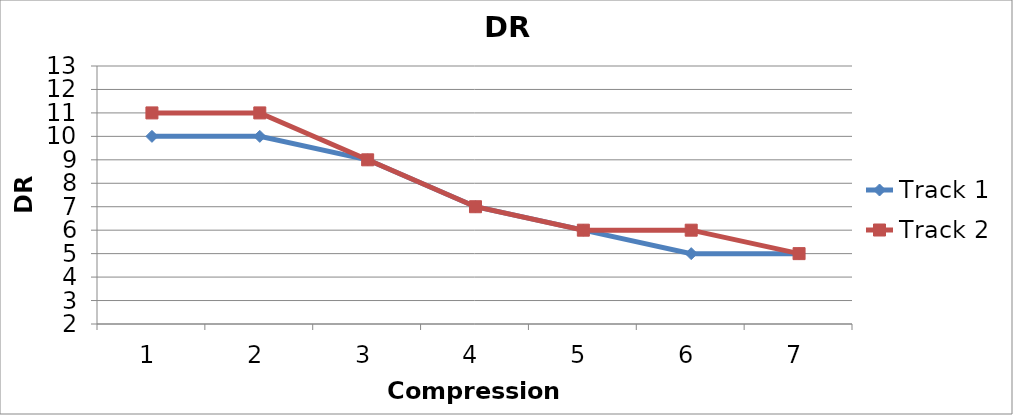
| Category | Track 1 | Track 2 |
|---|---|---|
| 0 | 10 | 11 |
| 1 | 10 | 11 |
| 2 | 9 | 9 |
| 3 | 7 | 7 |
| 4 | 6 | 6 |
| 5 | 5 | 6 |
| 6 | 5 | 5 |